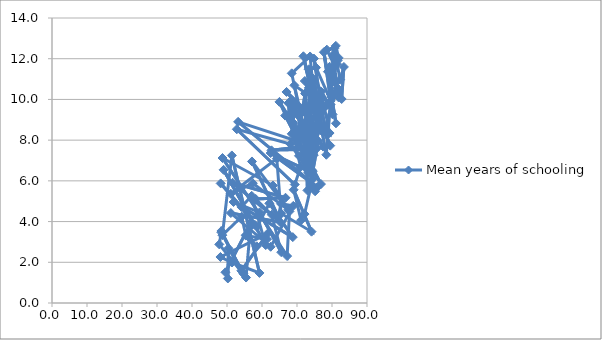
| Category | Mean years of schooling |
|---|---|
| 81.097 | 12.631 |
| 81.907 | 12.038 |
| 80.734 | 11.644 |
| 78.531 | 12.445 |
| 80.654 | 12.509 |
| 81.012 | 12.122 |
| 80.557 | 11.612 |
| 79.637 | 10.263 |
| 80.414 | 12.208 |
| 81.439 | 11.737 |
| 82.338 | 10.97 |
| 83.394 | 11.595 |
| 82.759 | 10.021 |
| 81.804 | 10.406 |
| 80.642 | 11.644 |
| 78.826 | 11.364 |
| 81.618 | 11.914 |
| 80.009 | 10.869 |
| 80.854 | 10.834 |
| 81.539 | 10.569 |
| 79.341 | 11.606 |
| 79.977 | 10.286 |
| 81.404 | 10.382 |
| 81.855 | 10.102 |
| 79.963 | 10.093 |
| 81.126 | 8.827 |
| 77.685 | 12.32 |
| 80.17 | 9.266 |
| 79.915 | 10.142 |
| 76.546 | 9.271 |
| 79.591 | 9.752 |
| 80.935 | 10.382 |
| 78.005 | 8.569 |
| 74.825 | 12.006 |
| 75.446 | 11.563 |
| 79.634 | 9.931 |
| 78.371 | 7.282 |
| 74.414 | 11.061 |
| 76.126 | 9.95 |
| 72.231 | 10.905 |
| 79.499 | 7.73 |
| 75.057 | 9.419 |
| 73.339 | 11.479 |
| 79.12 | 9.742 |
| 75.901 | 9.28 |
| 76.64 | 9.8 |
| 76.835 | 9.341 |
| 77.005 | 8.451 |
| 71.826 | 12.12 |
| 73.979 | 10.436 |
| 79.143 | 9.85 |
| 73.58 | 9.411 |
| 75.62 | 8.454 |
| 74.573 | 10.59 |
| 73.371 | 10.566 |
| 73.911 | 7.778 |
| 76.954 | 8.516 |
| 76.128 | 9.388 |
| 74.522 | 10.241 |
| 72.633 | 8.934 |
| 74.221 | 9.533 |
| 70.124 | 9.244 |
| 74.576 | 6.102 |
| 74.788 | 7.262 |
| 70.349 | 9.29 |
| 68.823 | 9.831 |
| 75.956 | 8.553 |
| 67.017 | 10.368 |
| 79.311 | 8.35 |
| 76.918 | 10.38 |
| 72.64 | 7.917 |
| 73.127 | 8.387 |
| 74.402 | 7.604 |
| 75.67 | 8.67 |
| 73.737 | 12.11 |
| 68.494 | 11.282 |
| 73.373 | 7.181 |
| 74.847 | 8.174 |
| 73.127 | 9.634 |
| 73.99 | 8.658 |
| 77.477 | 7.681 |
| 74.641 | 8.276 |
| 75.632 | 7.585 |
| 73.488 | 7.178 |
| 72.283 | 8.622 |
| 74.241 | 10.791 |
| 73.703 | 7.339 |
| 72.974 | 7.252 |
| 72.974 | 5.532 |
| 72.317 | 10.283 |
| 70.739 | 8.632 |
| 73.979 | 6.475 |
| 76.072 | 7.959 |
| 74.515 | 6.477 |
| 73.403 | 8.647 |
| 73.131 | 7.038 |
| 74.941 | 8.214 |
| 73.396 | 7.164 |
| 72.444 | 10.316 |
| 69.245 | 10.692 |
| 73.456 | 7.549 |
| 64.986 | 9.878 |
| 74.126 | 6.558 |
| 70.563 | 7.23 |
| 72.196 | 7.543 |
| 62.703 | 7.5 |
| 72.477 | 7.703 |
| 66.618 | 9.205 |
| 76.848 | 5.843 |
| 68.498 | 8.31 |
| 69.317 | 9.681 |
| 68.749 | 8.883 |
| 73.235 | 6.403 |
| 72.832 | 8.032 |
| 68.287 | 9.95 |
| 68.978 | 8.822 |
| 69.927 | 7.959 |
| 53.183 | 8.899 |
| 75.85 | 5.693 |
| 62.465 | 7.365 |
| 73.126 | 6.502 |
| 68.11 | 7.812 |
| 52.797 | 8.534 |
| 69.366 | 5.821 |
| 71.017 | 6.675 |
| 67.714 | 9.272 |
| 67.529 | 9.816 |
| 75.181 | 5.488 |
| 74.044 | 5.767 |
| 72.15 | 4.369 |
| 71.172 | 4.065 |
| 69.042 | 5.562 |
| 74.156 | 3.504 |
| 65.438 | 4.4 |
| 64.228 | 7.091 |
| 51.088 | 5.364 |
| 57.379 | 5.884 |
| 67.484 | 4.576 |
| 63.125 | 5.772 |
| 48.718 | 7.122 |
| 67.185 | 2.304 |
| 67.852 | 4.498 |
| 57.134 | 6.953 |
| 64.666 | 4.243 |
| 65.437 | 4.872 |
| 68.944 | 4.772 |
| 62.475 | 2.762 |
| 51.093 | 4.42 |
| 65.193 | 3.972 |
| 51.61 | 5.907 |
| 66.718 | 5.169 |
| 58.199 | 5.11 |
| 62.791 | 4.336 |
| 65.493 | 2.495 |
| 59.318 | 4.451 |
| 51.879 | 4.96 |
| 68.795 | 3.236 |
| 62.095 | 4.895 |
| 58.582 | 3.735 |
| 48.196 | 5.875 |
| 54.116 | 4.718 |
| 57.062 | 5.266 |
| 61.061 | 2.846 |
| 49.025 | 6.542 |
| 57.937 | 3.843 |
| 55.442 | 3.345 |
| 56.081 | 3.255 |
| 58.491 | 2.785 |
| 61.452 | 3.137 |
| 55.377 | 3.312 |
| 54.21 | 4.242 |
| 48.673 | 3.331 |
| 51.384 | 7.248 |
| 59.274 | 1.476 |
| 51.444 | 1.989 |
| 48.132 | 2.26 |
| 61.597 | 3.409 |
| 54.097 | 1.583 |
| 48.398 | 3.536 |
| 47.794 | 2.879 |
| 55.439 | 1.251 |
| 56.786 | 3.934 |
| 49.553 | 1.509 |
| 50.239 | 1.205 |
| 50.411 | 2.686 |
| 54.675 | 1.438 |
| 48.397 | 3.47 |